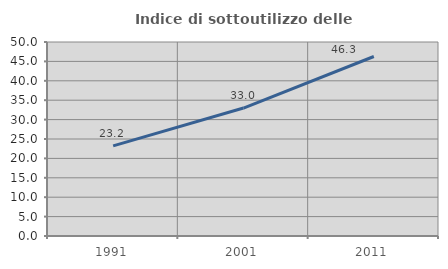
| Category | Indice di sottoutilizzo delle abitazioni  |
|---|---|
| 1991.0 | 23.231 |
| 2001.0 | 32.984 |
| 2011.0 | 46.267 |